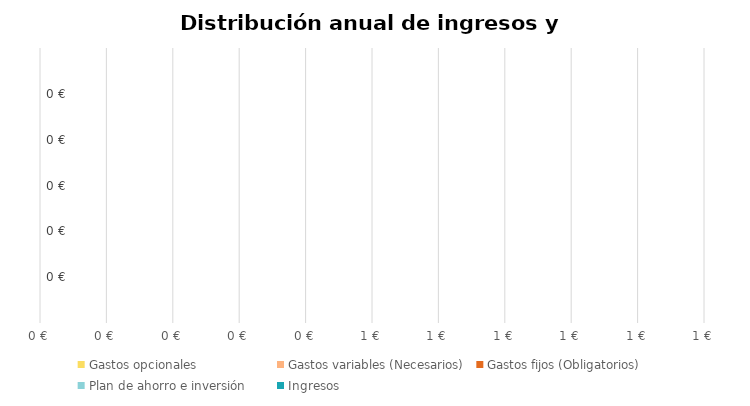
| Category |  Gastos opcionales  |  Gastos variables (Necesarios)  |  Gastos fijos (Obligatorios)  |  Plan de ahorro e inversión  |  Ingresos  |
|---|---|---|---|---|---|
| 0 | 0 | 0 | 0 | 0 | 0 |